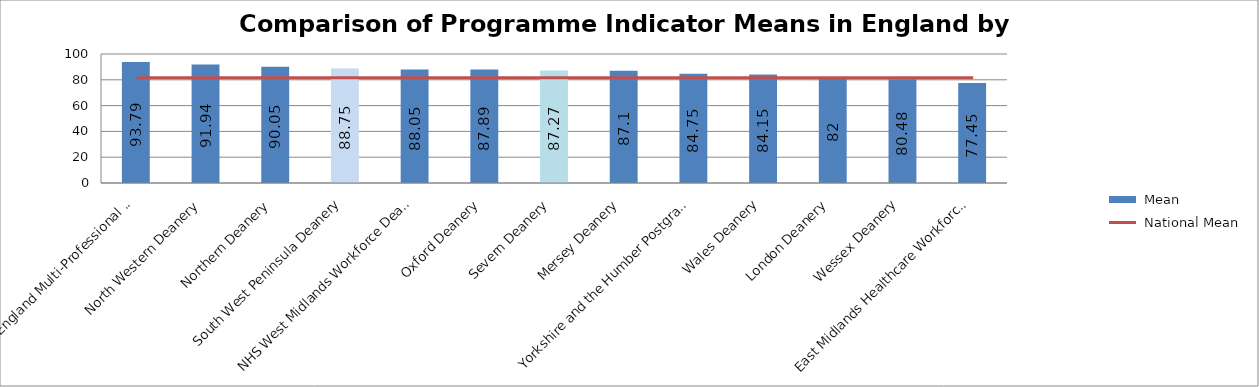
| Category |  Mean |
|---|---|
| East of England Multi-Professional Deanery | 93.79 |
| North Western Deanery | 91.94 |
| Northern Deanery | 90.05 |
| South West Peninsula Deanery | 88.75 |
| NHS West Midlands Workforce Deanery | 88.05 |
| Oxford Deanery | 87.89 |
| Severn Deanery | 87.27 |
| Mersey Deanery | 87.1 |
| Yorkshire and the Humber Postgraduate Deanery | 84.75 |
| Wales Deanery | 84.15 |
| London Deanery | 82 |
| Wessex Deanery | 80.48 |
| East Midlands Healthcare Workforce Deanery | 77.45 |